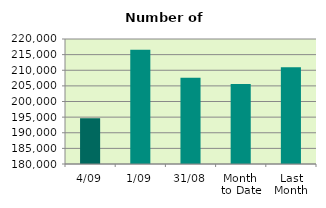
| Category | Series 0 |
|---|---|
| 4/09 | 194624 |
| 1/09 | 216598 |
| 31/08 | 207580 |
| Month 
to Date | 205611 |
| Last
Month | 210930.348 |